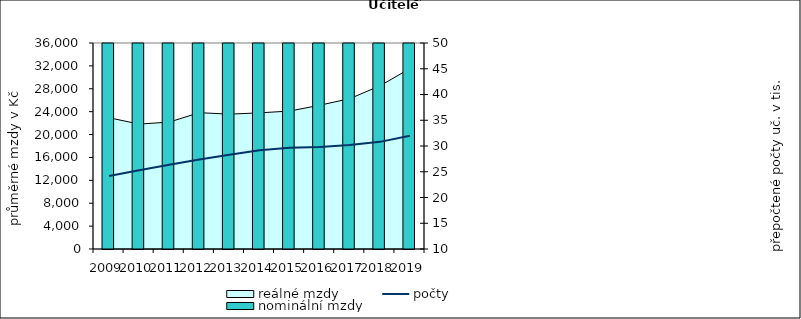
| Category | nominální mzdy |
|---|---|
| 2009.0 | 21036.65 |
| 2010.0 | 20298.604 |
| 2011.0 | 21024.77 |
| 2012.0 | 23326.585 |
| 2013.0 | 23398.844 |
| 2014.0 | 23720.195 |
| 2015.0 | 24108.013 |
| 2016.0 | 25299.673 |
| 2017.0 | 27089.125 |
| 2018.0 | 30020.6 |
| 2019.0 | 34154.64 |